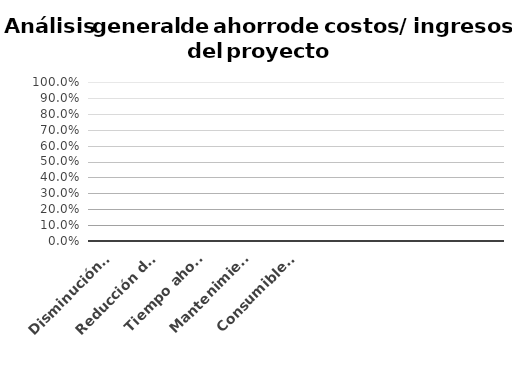
| Category | Series 0 |
|---|---|
| Disminución del soporte de mesa de ayuda | 0 |
| Reducción del personal administrativo | 0 |
| Tiempo ahorrado - creación manual de informes | 0 |
| Mantenimiento anual | 0 |
| Consumibles reducidos  | 0 |